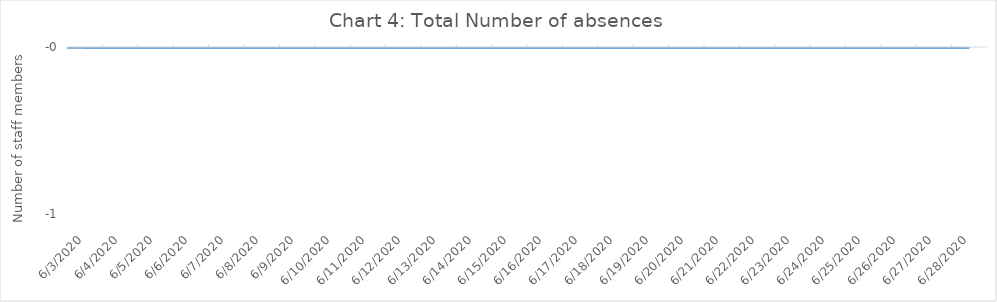
| Category | Total Number of absences (calculated automatically) |
|---|---|
| 6/3/20 | 0 |
| 6/4/20 | 0 |
| 6/5/20 | 0 |
| 6/6/20 | 0 |
| 6/7/20 | 0 |
| 6/8/20 | 0 |
| 6/9/20 | 0 |
| 6/10/20 | 0 |
| 6/11/20 | 0 |
| 6/12/20 | 0 |
| 6/13/20 | 0 |
| 6/14/20 | 0 |
| 6/15/20 | 0 |
| 6/16/20 | 0 |
| 6/17/20 | 0 |
| 6/18/20 | 0 |
| 6/19/20 | 0 |
| 6/20/20 | 0 |
| 6/21/20 | 0 |
| 6/22/20 | 0 |
| 6/23/20 | 0 |
| 6/24/20 | 0 |
| 6/25/20 | 0 |
| 6/26/20 | 0 |
| 6/27/20 | 0 |
| 6/28/20 | 0 |
| nan | 0 |
| nan | 0 |
| nan | 0 |
| nan | 0 |
| nan | 0 |
| nan | 0 |
| nan | 0 |
| nan | 0 |
| nan | 0 |
| nan | 0 |
| nan | 0 |
| nan | 0 |
| nan | 0 |
| nan | 0 |
| nan | 0 |
| nan | 0 |
| nan | 0 |
| nan | 0 |
| nan | 0 |
| nan | 0 |
| nan | 0 |
| nan | 0 |
| nan | 0 |
| nan | 0 |
| nan | 0 |
| nan | 0 |
| nan | 0 |
| nan | 0 |
| nan | 0 |
| nan | 0 |
| nan | 0 |
| nan | 0 |
| nan | 0 |
| nan | 0 |
| nan | 0 |
| nan | 0 |
| nan | 0 |
| nan | 0 |
| nan | 0 |
| nan | 0 |
| nan | 0 |
| nan | 0 |
| nan | 0 |
| nan | 0 |
| nan | 0 |
| nan | 0 |
| nan | 0 |
| nan | 0 |
| nan | 0 |
| nan | 0 |